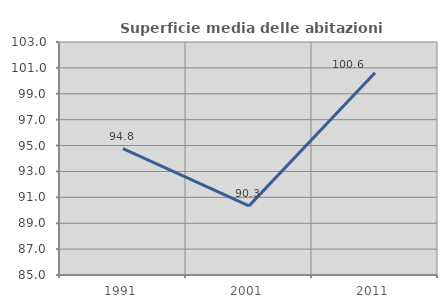
| Category | Superficie media delle abitazioni occupate |
|---|---|
| 1991.0 | 94.764 |
| 2001.0 | 90.339 |
| 2011.0 | 100.632 |